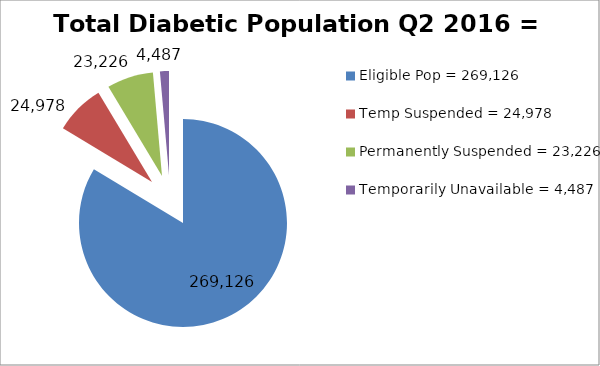
| Category | Total Diabetic Population Q2 2016 = 312,843 |
|---|---|
| Eligible Pop = 269,126 | 269126 |
| Temp Suspended = 24,978 | 24978 |
| Permanently Suspended = 23,226 | 23226 |
| Temporarily Unavailable = 4,487 | 4487 |